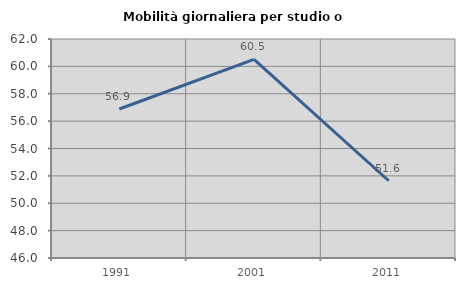
| Category | Mobilità giornaliera per studio o lavoro |
|---|---|
| 1991.0 | 56.886 |
| 2001.0 | 60.513 |
| 2011.0 | 51.643 |